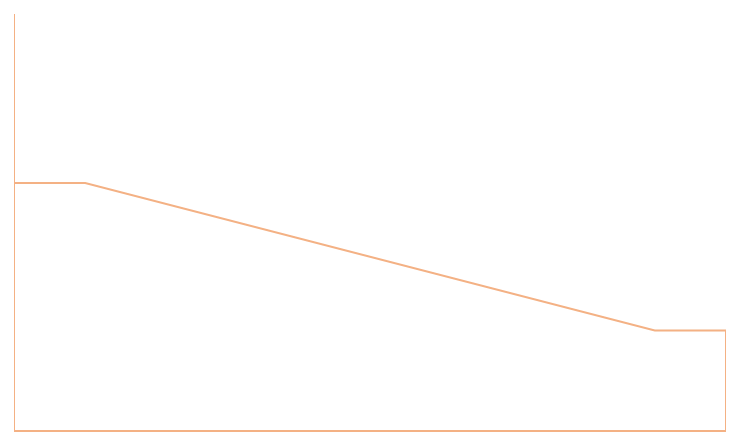
| Category | Series 0 | Series 1 | Series 2 |
|---|---|---|---|
| 0.0 | 1630.204 | 1.596 | 2381.361 |
| 10.0 | 1630.204 | 1.596 | 2381.361 |
| 90.0 | 3046.661 | 1.596 | 964.904 |
| 100.0 | 3046.661 | 1.596 | 964.904 |